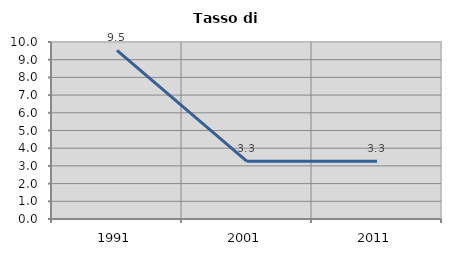
| Category | Tasso di disoccupazione   |
|---|---|
| 1991.0 | 9.524 |
| 2001.0 | 3.261 |
| 2011.0 | 3.266 |